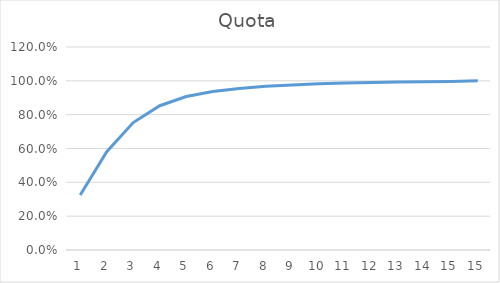
| Category | Quota |
|---|---|
| 1.0 | 0.325 |
| 2.0 | 0.581 |
| 3.0 | 0.753 |
| 4.0 | 0.853 |
| 5.0 | 0.908 |
| 6.0 | 0.937 |
| 7.0 | 0.955 |
| 8.0 | 0.967 |
| 9.0 | 0.976 |
| 10.0 | 0.982 |
| 11.0 | 0.987 |
| 12.0 | 0.99 |
| 13.0 | 0.993 |
| 14.0 | 0.994 |
| 15.0 | 0.996 |
| 15.0 | 1 |